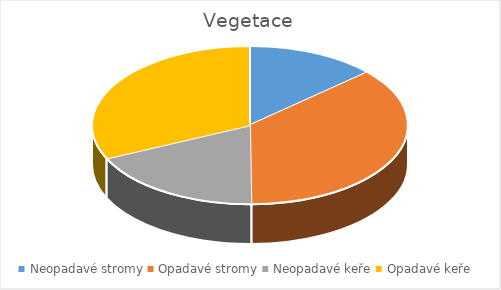
| Category | Series 0 |
|---|---|
| Neopadavé stromy | 26.608 |
| Opadavé stromy | 72.886 |
| Neopadavé keře | 36.329 |
| Opadavé keře | 63.671 |